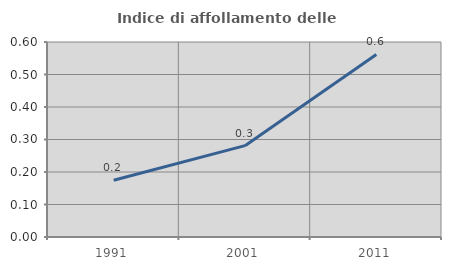
| Category | Indice di affollamento delle abitazioni  |
|---|---|
| 1991.0 | 0.175 |
| 2001.0 | 0.281 |
| 2011.0 | 0.562 |